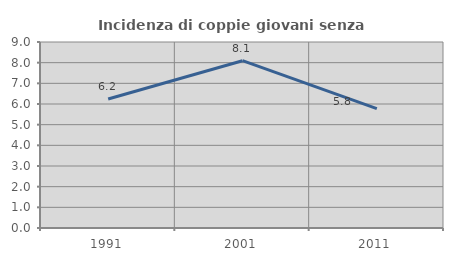
| Category | Incidenza di coppie giovani senza figli |
|---|---|
| 1991.0 | 6.239 |
| 2001.0 | 8.096 |
| 2011.0 | 5.775 |